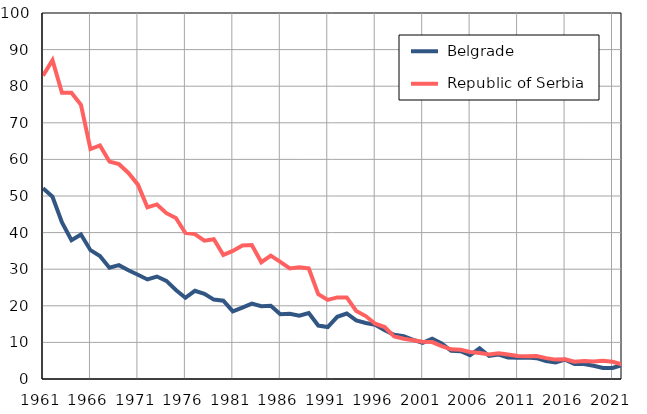
| Category |  Belgrade |  Republic of Serbia |
|---|---|---|
| 1961.0 | 52.1 | 82.9 |
| 1962.0 | 49.8 | 87.1 |
| 1963.0 | 42.8 | 78.2 |
| 1964.0 | 37.9 | 78.2 |
| 1965.0 | 39.5 | 74.9 |
| 1966.0 | 35.2 | 62.8 |
| 1967.0 | 33.6 | 63.8 |
| 1968.0 | 30.4 | 59.4 |
| 1969.0 | 31.1 | 58.7 |
| 1970.0 | 29.7 | 56.3 |
| 1971.0 | 28.5 | 53.1 |
| 1972.0 | 27.2 | 46.9 |
| 1973.0 | 28 | 47.7 |
| 1974.0 | 26.8 | 45.3 |
| 1975.0 | 24.3 | 44 |
| 1976.0 | 22.2 | 39.9 |
| 1977.0 | 24.1 | 39.6 |
| 1978.0 | 23.3 | 37.8 |
| 1979.0 | 21.7 | 38.2 |
| 1980.0 | 21.4 | 33.9 |
| 1981.0 | 18.5 | 35 |
| 1982.0 | 19.5 | 36.5 |
| 1983.0 | 20.6 | 36.6 |
| 1984.0 | 19.9 | 31.9 |
| 1985.0 | 20 | 33.7 |
| 1986.0 | 17.7 | 32 |
| 1987.0 | 17.8 | 30.2 |
| 1988.0 | 17.3 | 30.5 |
| 1989.0 | 18 | 30.2 |
| 1990.0 | 14.6 | 23.2 |
| 1991.0 | 14.2 | 21.6 |
| 1992.0 | 17 | 22.3 |
| 1993.0 | 17.9 | 22.3 |
| 1994.0 | 16 | 18.6 |
| 1995.0 | 15.3 | 17.2 |
| 1996.0 | 14.8 | 15.1 |
| 1997.0 | 13.3 | 14.2 |
| 1998.0 | 12.1 | 11.6 |
| 1999.0 | 11.7 | 11 |
| 2000.0 | 10.7 | 10.6 |
| 2001.0 | 9.9 | 10.2 |
| 2002.0 | 11 | 10.1 |
| 2003.0 | 9.7 | 9 |
| 2004.0 | 7.7 | 8.1 |
| 2005.0 | 7.6 | 8 |
| 2006.0 | 6.5 | 7.4 |
| 2007.0 | 8.4 | 7.1 |
| 2008.0 | 6.3 | 6.7 |
| 2009.0 | 6.7 | 7 |
| 2010.0 | 5.9 | 6.7 |
| 2011.0 | 5.8 | 6.3 |
| 2012.0 | 5.9 | 6.2 |
| 2013.0 | 5.7 | 6.3 |
| 2014.0 | 4.9 | 5.7 |
| 2015.0 | 4.5 | 5.3 |
| 2016.0 | 5.3 | 5.4 |
| 2017.0 | 4.1 | 4.7 |
| 2018.0 | 4.1 | 4.9 |
| 2019.0 | 3.6 | 4.8 |
| 2020.0 | 3 | 5 |
| 2021.0 | 3 | 4.7 |
| 2022.0 | 3.8 | 4 |